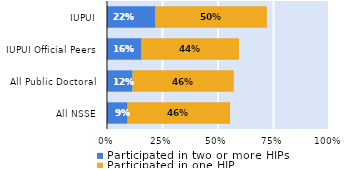
| Category | Participated in two or more HIPs | Participated in one HIP |
|---|---|---|
| All NSSE | 0.093 | 0.461 |
| All Public Doctoral | 0.115 | 0.456 |
| IUPUI Official Peers | 0.156 | 0.439 |
| IUPUI | 0.219 | 0.501 |